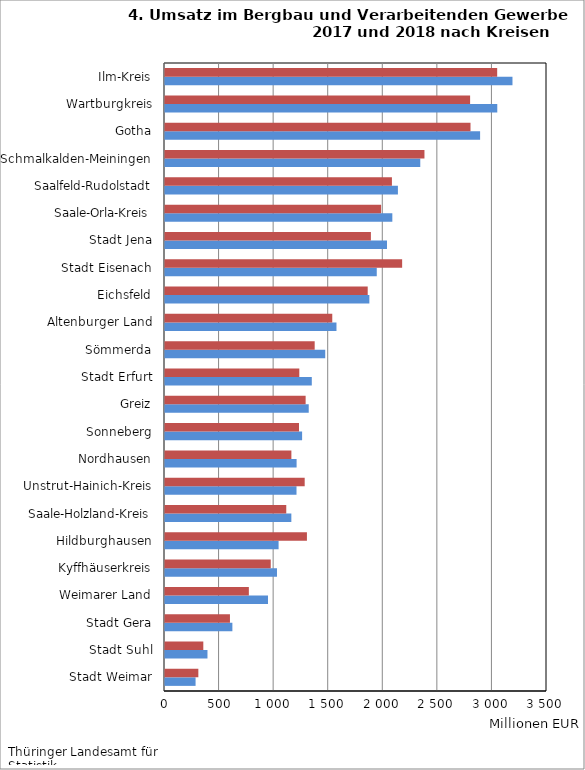
| Category | 2018 | 2017 |
|---|---|---|
| Stadt Weimar | 280.141 | 305.491 |
| Stadt Suhl | 389.18 | 350.993 |
| Stadt Gera | 617.327 | 595.112 |
| Weimarer Land | 943.688 | 768.309 |
| Kyffhäuserkreis | 1026.09 | 968.833 |
| Hildburghausen | 1040.765 | 1300.401 |
| Saale-Holzland-Kreis | 1157.619 | 1111.062 |
| Unstrut-Hainich-Kreis | 1204.924 | 1279.89 |
| Nordhausen | 1205.757 | 1157.94 |
| Sonneberg | 1256.251 | 1227.712 |
| Greiz | 1316.914 | 1288.529 |
| Stadt Erfurt | 1344.963 | 1230.598 |
| Sömmerda | 1468.151 | 1371.479 |
| Altenburger Land | 1571.086 | 1532.561 |
| Eichsfeld | 1872.431 | 1857.313 |
| Stadt Eisenach | 1940.2 | 2172.788 |
| Stadt Jena | 2033.988 | 1886.441 |
| Saale-Orla-Kreis | 2082.854 | 1980.142 |
| Saalfeld-Rudolstadt | 2134.01 | 2079.156 |
| Schmalkalden-Meiningen | 2338.876 | 2377.205 |
| Gotha | 2887.094 | 2799.165 |
| Wartburgkreis | 3044.398 | 2795.523 |
| Ilm-Kreis | 3183.665 | 3043.533 |